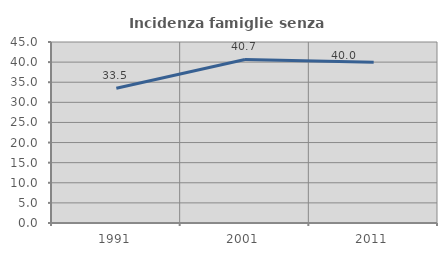
| Category | Incidenza famiglie senza nuclei |
|---|---|
| 1991.0 | 33.496 |
| 2001.0 | 40.665 |
| 2011.0 | 39.981 |